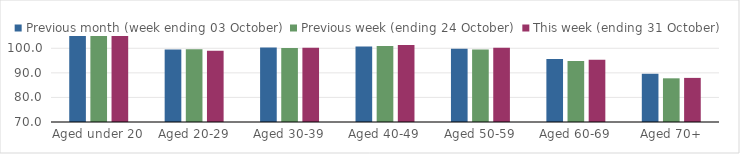
| Category | Previous month (week ending 03 October) | Previous week (ending 24 October) | This week (ending 31 October) |
|---|---|---|---|
| Aged under 20 | 105.51 | 108.52 | 109.39 |
| Aged 20-29 | 99.55 | 99.58 | 98.98 |
| Aged 30-39 | 100.37 | 100.15 | 100.18 |
| Aged 40-49 | 100.69 | 100.96 | 101.38 |
| Aged 50-59 | 99.83 | 99.51 | 100.17 |
| Aged 60-69 | 95.63 | 94.85 | 95.38 |
| Aged 70+ | 89.63 | 87.78 | 87.95 |